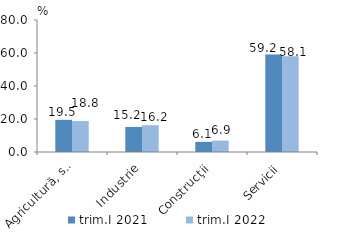
| Category | trim.I 2021 | trim.I 2022 |
|---|---|---|
| Agricultură, silvicultură şi pescuit | 19.507 | 18.751 |
| Industrie | 15.182 | 16.238 |
| Construcţii | 6.148 | 6.915 |
| Servicii | 59.163 | 58.096 |